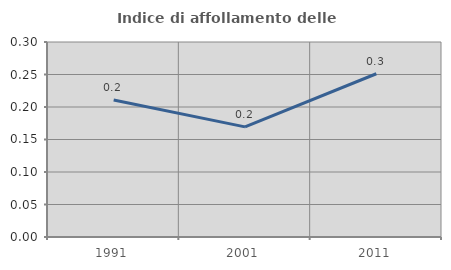
| Category | Indice di affollamento delle abitazioni  |
|---|---|
| 1991.0 | 0.211 |
| 2001.0 | 0.169 |
| 2011.0 | 0.251 |